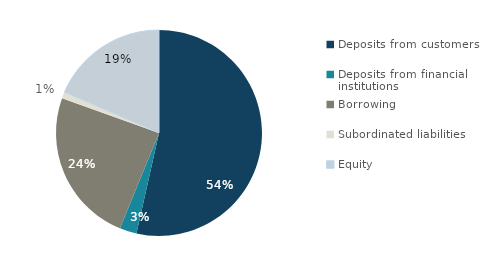
| Category | Series 0 |
|---|---|
| Deposits from customers | 693043 |
| Deposits from financial institutions | 34609 |
| Borrowing | 314412 |
| Subordinated liabilities | 13340 |
| Equity | 239610 |